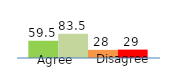
| Category | Series 0 | Series 1 | Series 2 | Series 3 |
|---|---|---|---|---|
| 0 | 59.5 | 83.5 | 28 | 29 |